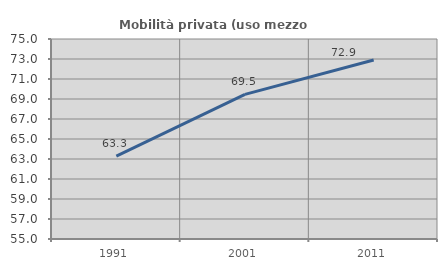
| Category | Mobilità privata (uso mezzo privato) |
|---|---|
| 1991.0 | 63.294 |
| 2001.0 | 69.458 |
| 2011.0 | 72.904 |